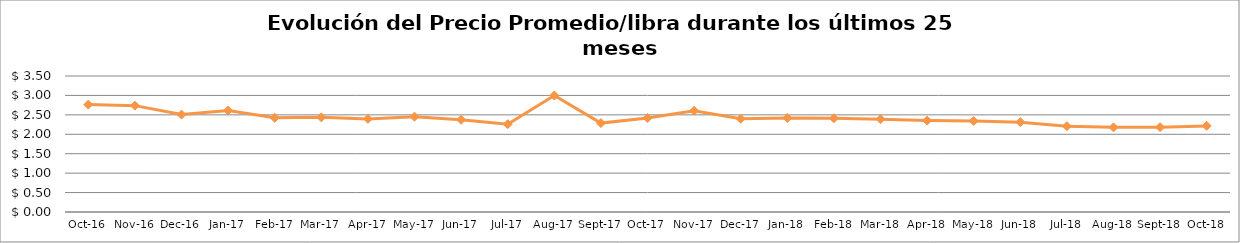
| Category | Series 0 |
|---|---|
| 2016-10-01 | 2.764 |
| 2016-11-01 | 2.737 |
| 2016-12-01 | 2.508 |
| 2017-01-01 | 2.615 |
| 2017-02-01 | 2.424 |
| 2017-03-01 | 2.436 |
| 2017-04-01 | 2.396 |
| 2017-05-01 | 2.452 |
| 2017-06-01 | 2.372 |
| 2017-07-01 | 2.26 |
| 2017-08-01 | 2.997 |
| 2017-09-01 | 2.288 |
| 2017-10-01 | 2.421 |
| 2017-11-01 | 2.605 |
| 2017-12-01 | 2.4 |
| 2018-01-01 | 2.42 |
| 2018-02-01 | 2.412 |
| 2018-03-01 | 2.388 |
| 2018-04-01 | 2.352 |
| 2018-05-01 | 2.341 |
| 2018-06-01 | 2.312 |
| 2018-07-01 | 2.209 |
| 2018-08-01 | 2.178 |
| 2018-09-01 | 2.184 |
| 2018-10-01 | 2.216 |